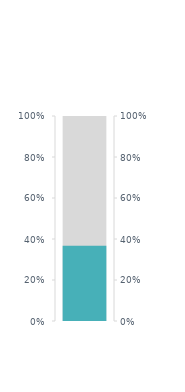
| Category | WeightToGo |
|---|---|
| 0 | 30 |